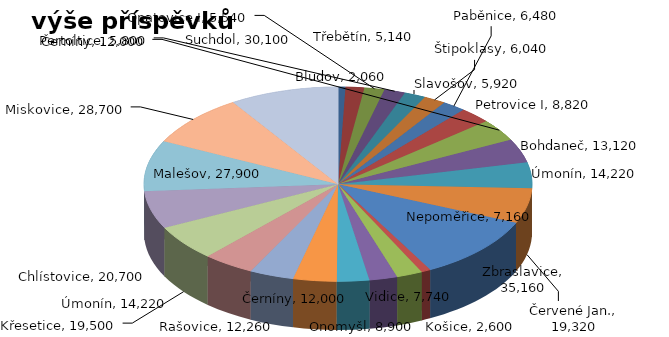
| Category | Series 0 |
|---|---|
| Bludov | 2060 |
| Třebětín | 5140 |
| Opatovice I | 5540 |
| Pertoltice | 5800 |
| Slavošov | 5920 |
| Štipoklasy | 6040 |
| Paběnice | 6480 |
| Petrovice I | 8820 |
| Černíny | 12000 |
| Bohdaneč | 13120 |
| Úmonín | 14220 |
| Červené Jan. | 19320 |
| Zbraslavice | 35160 |
| Košice | 2600 |
| Nepoměřice | 7160 |
| Vidice | 7740 |
| Onomyšl | 8900 |
| Černíny | 12000 |
| Rašovice | 12260 |
| Úmonín | 14220 |
| Křesetice | 19500 |
| Chlístovice | 20700 |
| Malešov | 27900 |
| Miskovice | 28700 |
| Suchdol | 30100 |